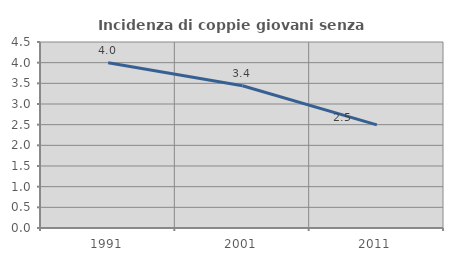
| Category | Incidenza di coppie giovani senza figli |
|---|---|
| 1991.0 | 4 |
| 2001.0 | 3.441 |
| 2011.0 | 2.494 |